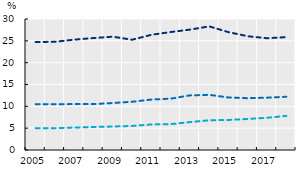
| Category | 15 - 29 | 30 - 49 | 50 - 69 |
|---|---|---|---|
| 2005.0 | 5.007 | 10.5 | 24.737 |
| 2006.0 | 5.004 | 10.486 | 24.779 |
| 2007.0 | 5.146 | 10.513 | 25.273 |
| 2008.0 | 5.266 | 10.511 | 25.638 |
| 2009.0 | 5.376 | 10.763 | 25.951 |
| 2010.0 | 5.505 | 11.049 | 25.25 |
| 2011.0 | 5.853 | 11.55 | 26.381 |
| 2012.0 | 5.918 | 11.76 | 27.017 |
| 2013.0 | 6.392 | 12.506 | 27.569 |
| 2014.0 | 6.798 | 12.639 | 28.312 |
| 2015.0 | 6.881 | 12.022 | 26.99 |
| 2016.0 | 7.114 | 11.86 | 26.047 |
| 2017.0 | 7.382 | 11.983 | 25.6 |
| 2018.0 | 7.811 | 12.191 | 25.854 |